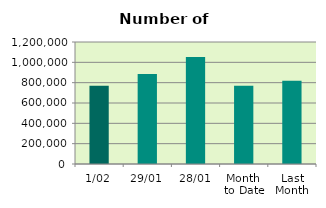
| Category | Series 0 |
|---|---|
| 1/02 | 769916 |
| 29/01 | 885962 |
| 28/01 | 1052256 |
| Month 
to Date | 769916 |
| Last
Month | 819236.4 |